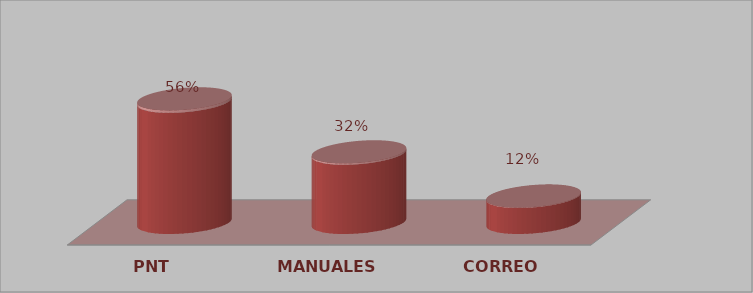
| Category | Series 0 | Series 1 |
|---|---|---|
| PNT | 28 | 0.56 |
| MANUALES | 16 | 0.32 |
| CORREO | 6 | 0.12 |